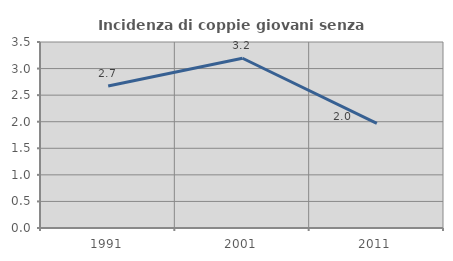
| Category | Incidenza di coppie giovani senza figli |
|---|---|
| 1991.0 | 2.671 |
| 2001.0 | 3.194 |
| 2011.0 | 1.969 |